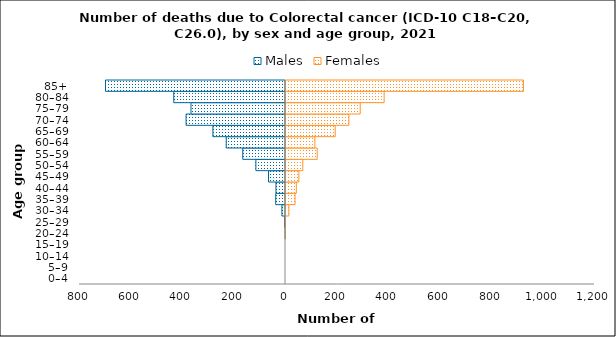
| Category | Males | Females |
|---|---|---|
| 0–4 | 0 | 0 |
| 5–9 | 0 | 0 |
| 10–14 | 0 | 0 |
| 15–19 | 0 | 0 |
| 20–24 | -1 | 2 |
| 25–29 | -3 | 2 |
| 30–34 | -14 | 15 |
| 35–39 | -38 | 39 |
| 40–44 | -37 | 44 |
| 45–49 | -66 | 54 |
| 50–54 | -115 | 69 |
| 55–59 | -166 | 125 |
| 60–64 | -230 | 116 |
| 65–69 | -282 | 195 |
| 70–74 | -386 | 248 |
| 75–79 | -367 | 292 |
| 80–84 | -434 | 385 |
| 85+ | -699 | 926 |